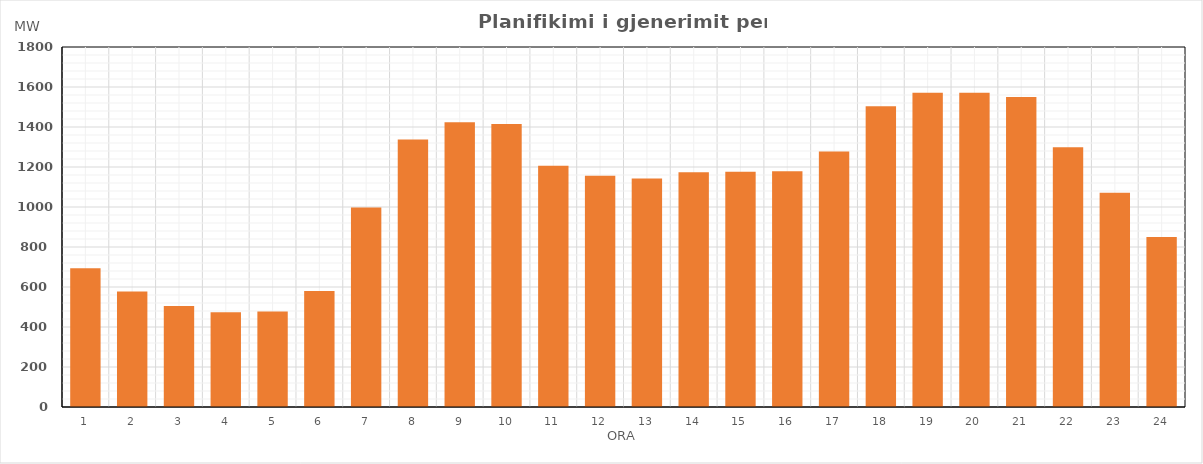
| Category | Max (MW) |
|---|---|
| 0 | 694.02 |
| 1 | 578.02 |
| 2 | 505.02 |
| 3 | 474.02 |
| 4 | 478.02 |
| 5 | 580.02 |
| 6 | 997.02 |
| 7 | 1338.02 |
| 8 | 1423.986 |
| 9 | 1414.905 |
| 10 | 1206.751 |
| 11 | 1156.646 |
| 12 | 1142.486 |
| 13 | 1173.54 |
| 14 | 1176.499 |
| 15 | 1178.461 |
| 16 | 1277.617 |
| 17 | 1504.175 |
| 18 | 1570.736 |
| 19 | 1571.855 |
| 20 | 1549.727 |
| 21 | 1299.143 |
| 22 | 1070.991 |
| 23 | 850.571 |